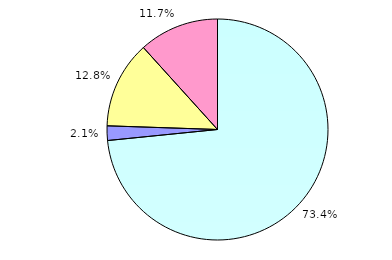
| Category | Series 0 |
|---|---|
| ledig | 69 |
| verheiratet | 2 |
| geschieden | 12 |
| sonstige | 11 |